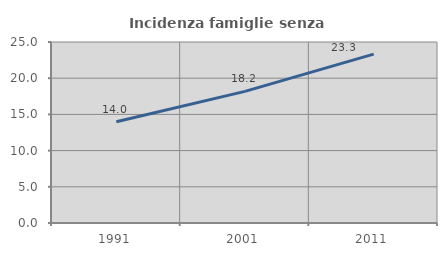
| Category | Incidenza famiglie senza nuclei |
|---|---|
| 1991.0 | 13.985 |
| 2001.0 | 18.177 |
| 2011.0 | 23.328 |